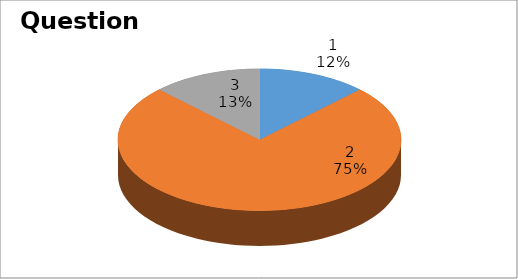
| Category | Series 0 |
|---|---|
| 0 | 1 |
| 1 | 6 |
| 2 | 1 |